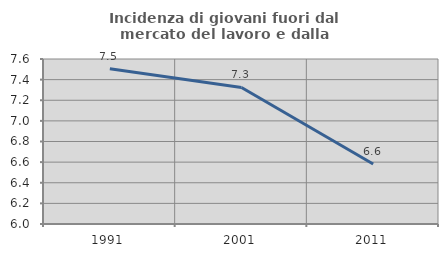
| Category | Incidenza di giovani fuori dal mercato del lavoro e dalla formazione  |
|---|---|
| 1991.0 | 7.506 |
| 2001.0 | 7.324 |
| 2011.0 | 6.581 |